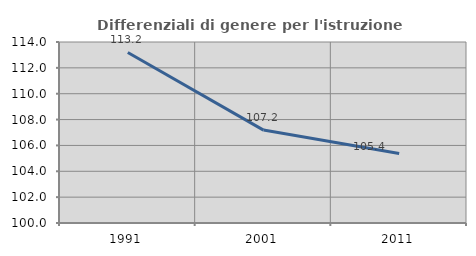
| Category | Differenziali di genere per l'istruzione superiore |
|---|---|
| 1991.0 | 113.193 |
| 2001.0 | 107.187 |
| 2011.0 | 105.372 |